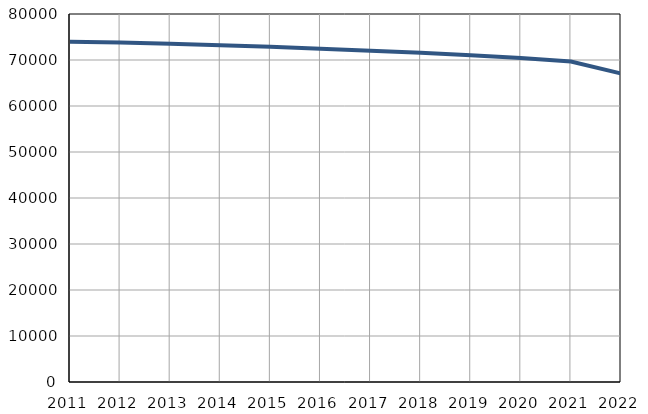
| Category | Population
size |
|---|---|
| 2011.0 | 73977 |
| 2012.0 | 73789 |
| 2013.0 | 73512 |
| 2014.0 | 73200 |
| 2015.0 | 72856 |
| 2016.0 | 72443 |
| 2017.0 | 72020 |
| 2018.0 | 71551 |
| 2019.0 | 71050 |
| 2020.0 | 70460 |
| 2021.0 | 69654 |
| 2022.0 | 67054 |